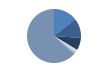
| Category | Series 0 |
|---|---|
| ARRASTRE | 109 |
| CERCO | 91 |
| PALANGRE | 57 |
| REDES DE ENMALLE | 13 |
| ARTES FIJAS | 9 |
| ARTES MENORES | 485 |